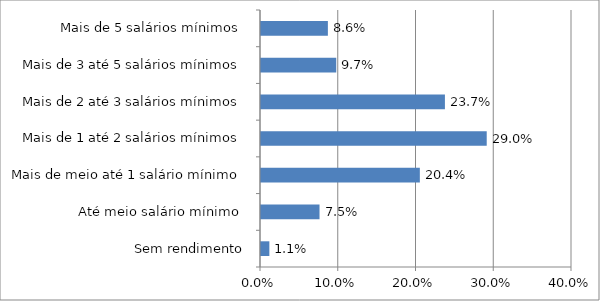
| Category | Series 0 |
|---|---|
| Sem rendimento | 0.011 |
| Até meio salário mínimo  | 0.075 |
| Mais de meio até 1 salário mínimo  | 0.204 |
| Mais de 1 até 2 salários mínimos  | 0.29 |
| Mais de 2 até 3 salários mínimos  | 0.237 |
| Mais de 3 até 5 salários mínimos  | 0.097 |
| Mais de 5 salários mínimos  | 0.086 |